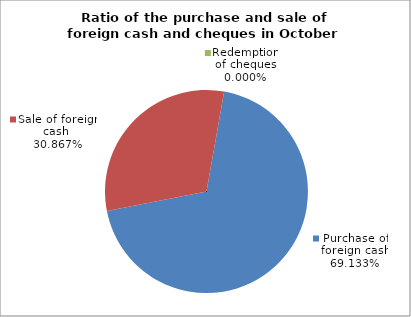
| Category | Purchase of foreign cash |
|---|---|
| 0 | 0.691 |
| 1 | 0.309 |
| 2 | 0 |